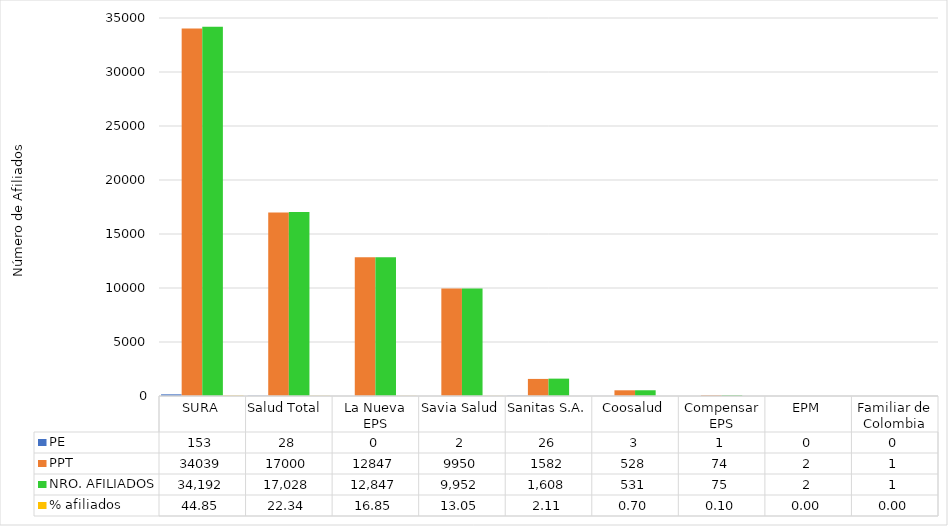
| Category | PE | PPT | NRO. AFILIADOS | % afiliados |
|---|---|---|---|---|
| SURA | 153 | 34039 | 34192 | 44.85 |
| Salud Total  | 28 | 17000 | 17028 | 22.336 |
| La Nueva EPS | 0 | 12847 | 12847 | 16.852 |
| Savia Salud | 2 | 9950 | 9952 | 13.054 |
| Sanitas S.A. | 26 | 1582 | 1608 | 2.109 |
| Coosalud | 3 | 528 | 531 | 0.697 |
| Compensar EPS | 1 | 74 | 75 | 0.098 |
| EPM | 0 | 2 | 2 | 0.003 |
| Familiar de Colombia | 0 | 1 | 1 | 0.001 |